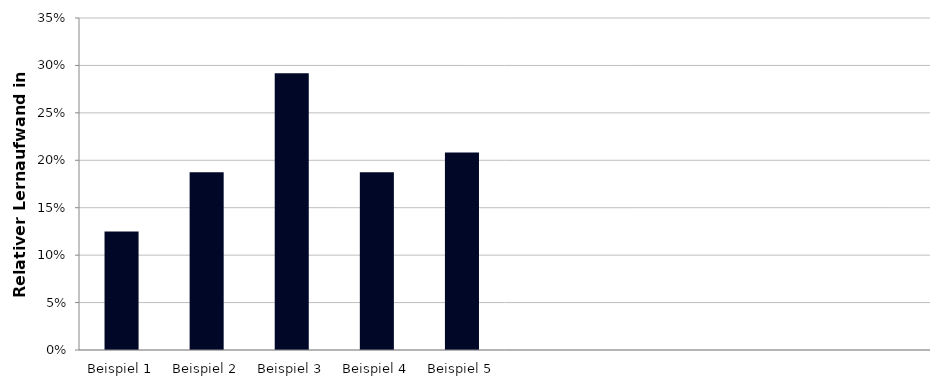
| Category | Relativer Lernaufwand |
|---|---|
| Beispiel 1 | 0.125 |
| Beispiel 2 | 0.188 |
| Beispiel 3 | 0.292 |
| Beispiel 4 | 0.188 |
| Beispiel 5 | 0.208 |